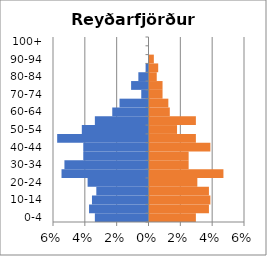
| Category | % Men | % Women |
|---|---|---|
| 0-4 | -0.034 | 0.029 |
| 5-9 | -0.037 | 0.037 |
| 10-14 | -0.036 | 0.038 |
| 15-19 | -0.033 | 0.037 |
| 20-24 | -0.038 | 0.03 |
| 25-29 | -0.055 | 0.046 |
| 30-34 | -0.053 | 0.025 |
| 35-39 | -0.041 | 0.025 |
| 40-44 | -0.041 | 0.038 |
| 45-49 | -0.057 | 0.029 |
| 50-54 | -0.042 | 0.017 |
| 55-59 | -0.034 | 0.029 |
| 60-64 | -0.023 | 0.013 |
| 65-69 | -0.018 | 0.012 |
| 70-74 | -0.005 | 0.008 |
| 75-79 | -0.011 | 0.008 |
| 80-84 | -0.006 | 0.005 |
| 85-89 | -0.002 | 0.005 |
| 90-94 | 0 | 0.003 |
| 95-99 | 0 | 0 |
| 100+ | 0 | 0 |